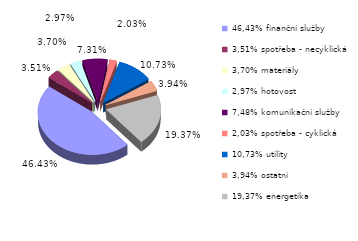
| Category | Series 0 |
|---|---|
| 46,43% finanční služby | 0.464 |
| 3,51% spotřeba - necyklická | 0.035 |
| 3,70% materiály | 0.037 |
| 2,97% hotovost | 0.03 |
| 7,48% komunikační služby | 0.073 |
| 2,03% spotřeba - cyklická | 0.02 |
| 10,73% utility | 0.107 |
| 3,94% ostatní | 0.039 |
| 19,37% energetika | 0.194 |